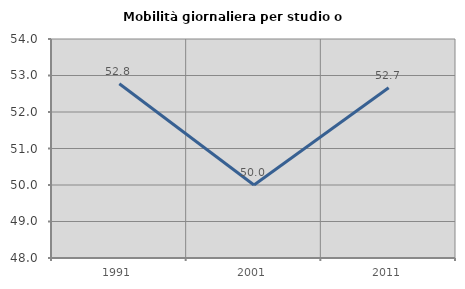
| Category | Mobilità giornaliera per studio o lavoro |
|---|---|
| 1991.0 | 52.774 |
| 2001.0 | 50 |
| 2011.0 | 52.665 |